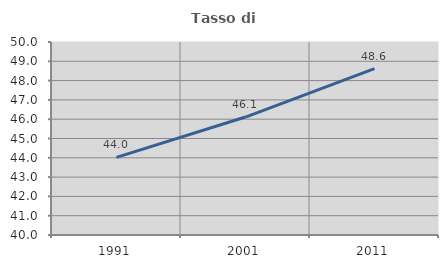
| Category | Tasso di occupazione   |
|---|---|
| 1991.0 | 44.024 |
| 2001.0 | 46.112 |
| 2011.0 | 48.624 |